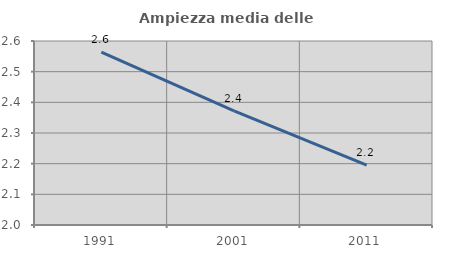
| Category | Ampiezza media delle famiglie |
|---|---|
| 1991.0 | 2.564 |
| 2001.0 | 2.372 |
| 2011.0 | 2.195 |